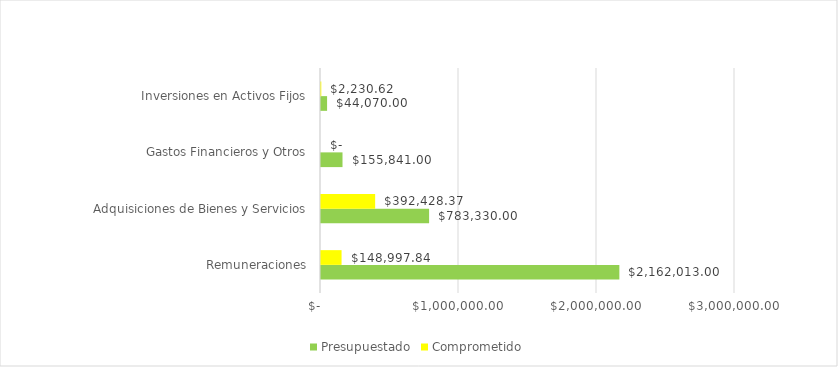
| Category |  Presupuestado  |  Comprometido  |
|---|---|---|
| Remuneraciones | 2162013 | 148997.84 |
| Adquisiciones de Bienes y Servicios | 783330 | 392428.37 |
| Gastos Financieros y Otros | 155841 | 0 |
| Inversiones en Activos Fijos | 44070 | 2230.62 |